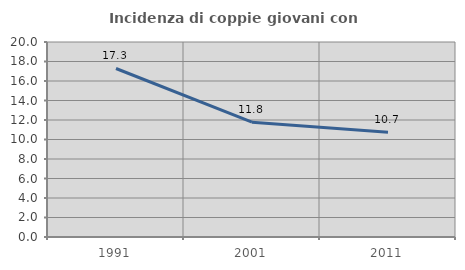
| Category | Incidenza di coppie giovani con figli |
|---|---|
| 1991.0 | 17.284 |
| 2001.0 | 11.772 |
| 2011.0 | 10.734 |